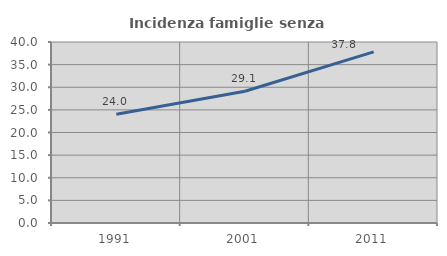
| Category | Incidenza famiglie senza nuclei |
|---|---|
| 1991.0 | 24.038 |
| 2001.0 | 29.126 |
| 2011.0 | 37.824 |